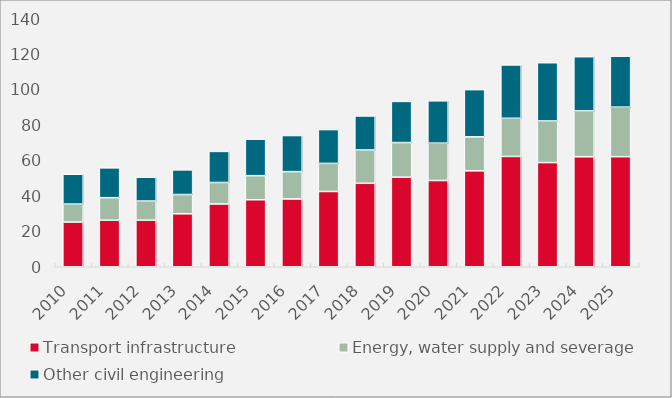
| Category | Transport infrastructure | Energy, water supply and severage | Other civil engineering |
|---|---|---|---|
| 2010.0 | 25.245 | 10.134 | 16.854 |
| 2011.0 | 26.285 | 12.708 | 16.838 |
| 2012.0 | 26.277 | 10.816 | 13.423 |
| 2013.0 | 29.907 | 10.863 | 13.922 |
| 2014.0 | 35.467 | 12.103 | 17.542 |
| 2015.0 | 37.823 | 13.591 | 20.616 |
| 2016.0 | 38.28 | 15.421 | 20.367 |
| 2017.0 | 42.496 | 15.842 | 19.101 |
| 2018.0 | 47.119 | 18.802 | 19.2 |
| 2019.0 | 50.591 | 19.516 | 23.221 |
| 2020.0 | 48.686 | 21.086 | 23.895 |
| 2021.0 | 54.155 | 19.204 | 26.626 |
| 2022.0 | 62.274 | 21.532 | 30.14 |
| 2023.0 | 58.81 | 23.492 | 32.881 |
| 2024.0 | 62.098 | 25.885 | 30.597 |
| 2025.0 | 62.144 | 27.955 | 28.8 |